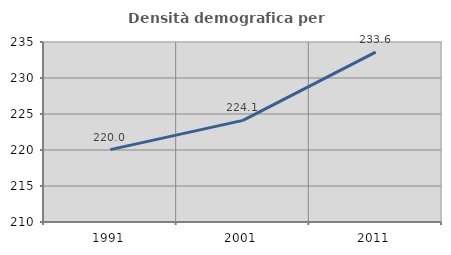
| Category | Densità demografica |
|---|---|
| 1991.0 | 220.05 |
| 2001.0 | 224.116 |
| 2011.0 | 233.604 |